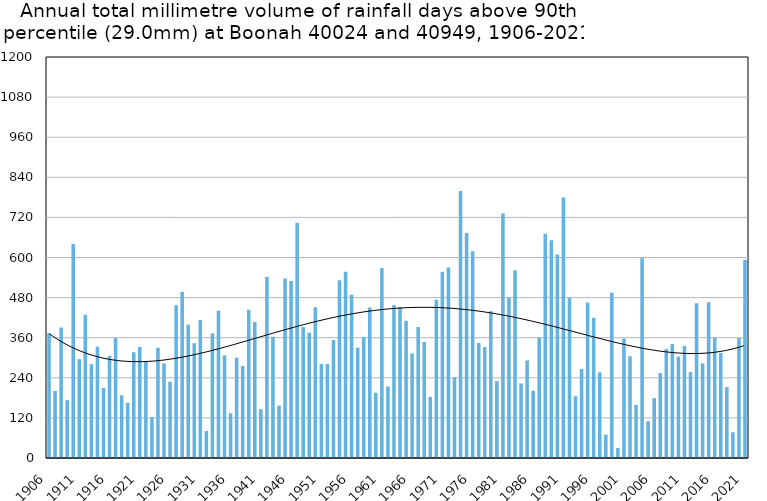
| Category | Annual total mm in days above 90th percentile |
|---|---|
| 1906 | 373.4 |
| 1907 | 200.7 |
| 1908 | 390.4 |
| 1909 | 173 |
| 1910 | 640.7 |
| 1911 | 295.7 |
| 1912 | 428.5 |
| 1913 | 280.6 |
| 1914 | 333.2 |
| 1915 | 209.5 |
| 1916 | 305.3 |
| 1917 | 359 |
| 1918 | 187.8 |
| 1919 | 165.2 |
| 1920 | 316.4 |
| 1921 | 332.2 |
| 1922 | 287.5 |
| 1923 | 122.4 |
| 1924 | 329.9 |
| 1925 | 282.9 |
| 1926 | 228.2 |
| 1927 | 457.5 |
| 1928 | 497.3 |
| 1929 | 399.2 |
| 1930 | 343.4 |
| 1931 | 412.8 |
| 1932 | 80.8 |
| 1933 | 373.3 |
| 1934 | 440.8 |
| 1935 | 307.2 |
| 1936 | 134.1 |
| 1937 | 300.2 |
| 1938 | 275.6 |
| 1939 | 443.9 |
| 1940 | 406.8 |
| 1941 | 146 |
| 1942 | 542 |
| 1943 | 362.6 |
| 1944 | 156.8 |
| 1945 | 537 |
| 1946 | 529.9 |
| 1947 | 703.9 |
| 1948 | 391.9 |
| 1949 | 375.1 |
| 1950 | 451.3 |
| 1951 | 281.6 |
| 1952 | 281.5 |
| 1953 | 352.9 |
| 1954 | 531.6 |
| 1955 | 557.4 |
| 1956 | 488.9 |
| 1957 | 330.2 |
| 1958 | 362.2 |
| 1959 | 450.4 |
| 1960 | 195.1 |
| 1961 | 568.5 |
| 1962 | 213.9 |
| 1963 | 457.5 |
| 1964 | 451.2 |
| 1965 | 410.5 |
| 1966 | 313 |
| 1967 | 392.2 |
| 1968 | 347.2 |
| 1969 | 182.4 |
| 1970 | 473.6 |
| 1971 | 557.4 |
| 1972 | 570.1 |
| 1973 | 241.8 |
| 1974 | 799 |
| 1975 | 673 |
| 1976 | 618.9 |
| 1977 | 344 |
| 1978 | 332 |
| 1979 | 439.4 |
| 1980 | 230.2 |
| 1981 | 732 |
| 1982 | 479.1 |
| 1983 | 561.8 |
| 1984 | 223 |
| 1985 | 292 |
| 1986 | 201.2 |
| 1987 | 360 |
| 1988 | 671.4 |
| 1989 | 651.8 |
| 1990 | 608.8 |
| 1991 | 779.4 |
| 1992 | 479 |
| 1993 | 184.8 |
| 1994 | 266.2 |
| 1995 | 465.4 |
| 1996 | 419.4 |
| 1997 | 256.2 |
| 1998 | 70 |
| 1999 | 494.8 |
| 2000 | 30.2 |
| 2001 | 357.4 |
| 2002 | 304.6 |
| 2003 | 159 |
| 2004 | 598.2 |
| 2005 | 110.2 |
| 2006 | 179.2 |
| 2007 | 254 |
| 2008 | 326 |
| 2009 | 341 |
| 2010 | 303 |
| 2011 | 335 |
| 2012 | 257 |
| 2013 | 463 |
| 2014 | 283 |
| 2015 | 466 |
| 2016 | 360 |
| 2017 | 314 |
| 2018 | 212 |
| 2019 | 77 |
| 2020 | 359 |
| 2021 | 593 |